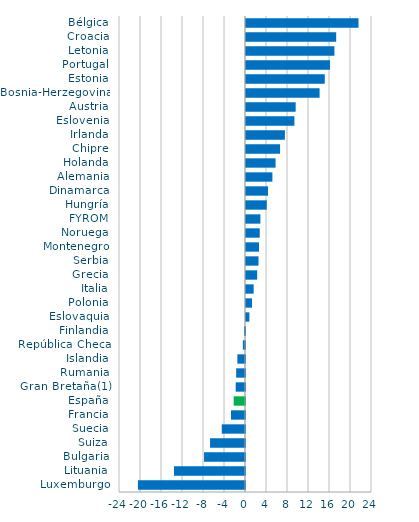
| Category | Series 0 |
|---|---|
| Luxemburgo | -20.397 |
| Lituania | -13.531 |
| Bulgaria | -7.799 |
| Suiza | -6.653 |
| Suecia | -4.426 |
| Francia | -2.67 |
| España | -2.155 |
| Gran Bretaña(1) | -1.775 |
| Rumania | -1.684 |
| Islandia | -1.456 |
| República Checa | -0.41 |
| Finlandia | -0.178 |
| Eslovaquia | 0.643 |
| Polonia | 1.141 |
| Italia | 1.46 |
| Grecia | 2.128 |
| Serbia | 2.382 |
| Montenegro | 2.476 |
| Noruega | 2.616 |
| FYROM | 2.74 |
| Hungría | 3.953 |
| Dinamarca | 4.192 |
| Alemania | 5.03 |
| Holanda | 5.635 |
| Chipre | 6.493 |
| Irlanda | 7.407 |
| Eslovenia | 9.221 |
| Austria | 9.462 |
| Bosnia-Herzegovina | 14.019 |
| Estonia | 15.006 |
| Portugal | 16.007 |
| Letonia | 16.84 |
| Croacia | 17.178 |
| Bélgica | 21.431 |